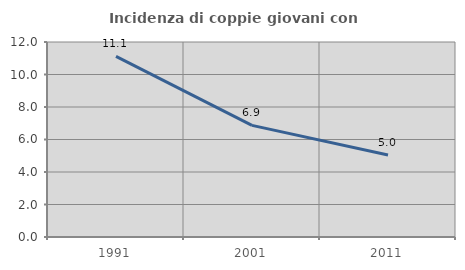
| Category | Incidenza di coppie giovani con figli |
|---|---|
| 1991.0 | 11.111 |
| 2001.0 | 6.87 |
| 2011.0 | 5.046 |